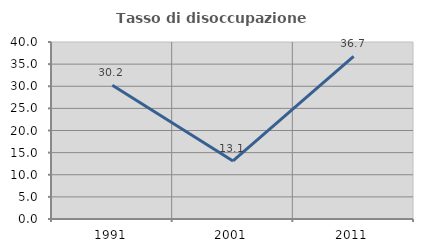
| Category | Tasso di disoccupazione giovanile  |
|---|---|
| 1991.0 | 30.233 |
| 2001.0 | 13.115 |
| 2011.0 | 36.735 |